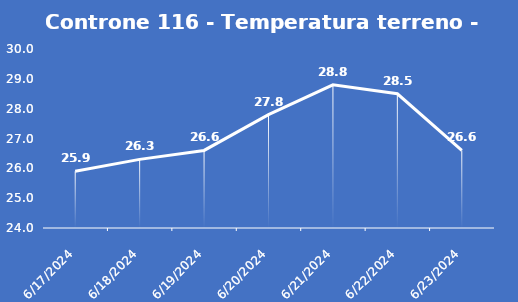
| Category | Controne 116 - Temperatura terreno - Grezzo (°C) |
|---|---|
| 6/17/24 | 25.9 |
| 6/18/24 | 26.3 |
| 6/19/24 | 26.6 |
| 6/20/24 | 27.8 |
| 6/21/24 | 28.8 |
| 6/22/24 | 28.5 |
| 6/23/24 | 26.6 |